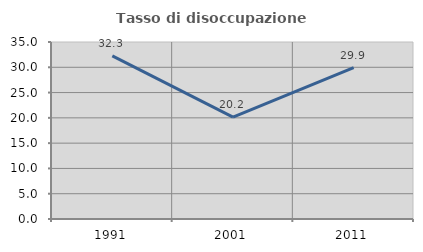
| Category | Tasso di disoccupazione giovanile  |
|---|---|
| 1991.0 | 32.264 |
| 2001.0 | 20.155 |
| 2011.0 | 29.921 |